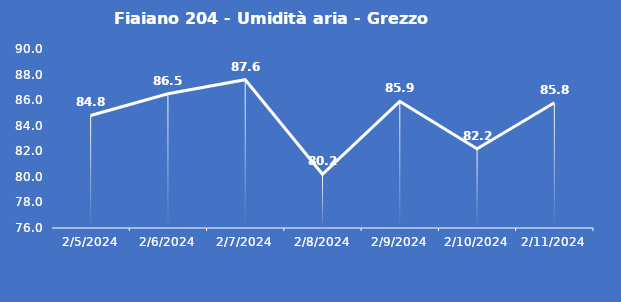
| Category | Fiaiano 204 - Umidità aria - Grezzo (%) |
|---|---|
| 2/5/24 | 84.8 |
| 2/6/24 | 86.5 |
| 2/7/24 | 87.6 |
| 2/8/24 | 80.2 |
| 2/9/24 | 85.9 |
| 2/10/24 | 82.2 |
| 2/11/24 | 85.8 |